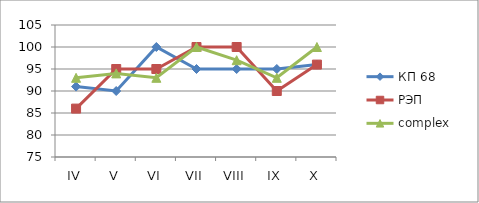
| Category | КП 68 | РЭП  | complex |
|---|---|---|---|
| IV | 91 | 86 | 93 |
| V | 90 | 95 | 94 |
| VI | 100 | 95 | 93 |
| VII | 95 | 100 | 100 |
| VIII | 95 | 100 | 97 |
| IX | 95 | 90 | 93 |
| X | 96 | 96 | 100 |